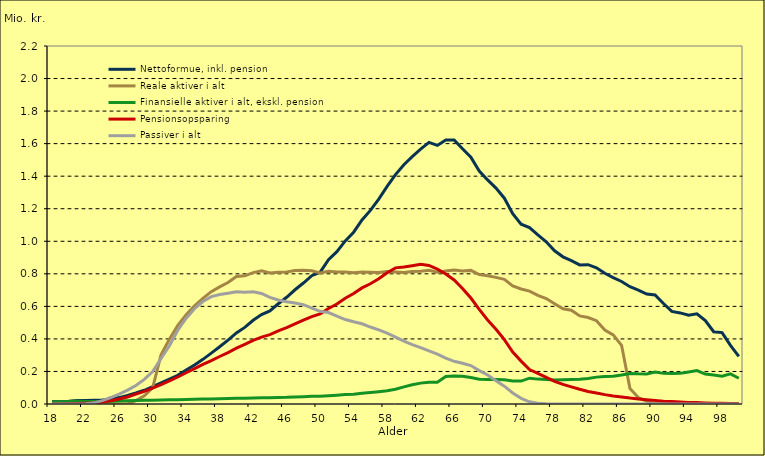
| Category | Nettoformue, inkl. pension | Reale aktiver i alt | Finansielle aktiver i alt, ekskl. pension | Pensionsopsparing | Passiver i alt |
|---|---|---|---|---|---|
| 18.0 | 0.015 | 0 | 0.014 | 0 | 0 |
| 19.0 | 0.015 | 0 | 0.014 | 0 | 0 |
| 20.0 | 0.017 | 0 | 0.015 | 0.001 | 0 |
| 21.0 | 0.022 | 0 | 0.018 | 0.002 | 0 |
| 22.0 | 0.021 | 0 | 0.015 | 0.005 | 0.001 |
| 23.0 | 0.023 | 0 | 0.015 | 0.008 | 0.007 |
| 24.0 | 0.025 | 0 | 0.015 | 0.013 | 0.021 |
| 25.0 | 0.03 | 0 | 0.016 | 0.019 | 0.04 |
| 26.0 | 0.039 | 0 | 0.018 | 0.03 | 0.061 |
| 27.0 | 0.053 | 0 | 0.019 | 0.043 | 0.085 |
| 28.0 | 0.068 | 0.021 | 0.021 | 0.06 | 0.114 |
| 29.0 | 0.084 | 0.05 | 0.022 | 0.078 | 0.152 |
| 30.0 | 0.106 | 0.1 | 0.024 | 0.098 | 0.2 |
| 31.0 | 0.129 | 0.302 | 0.025 | 0.119 | 0.28 |
| 32.0 | 0.153 | 0.399 | 0.026 | 0.142 | 0.358 |
| 33.0 | 0.176 | 0.483 | 0.027 | 0.166 | 0.453 |
| 34.0 | 0.209 | 0.548 | 0.028 | 0.192 | 0.527 |
| 35.0 | 0.24 | 0.603 | 0.029 | 0.218 | 0.586 |
| 36.0 | 0.274 | 0.649 | 0.03 | 0.243 | 0.629 |
| 37.0 | 0.313 | 0.69 | 0.031 | 0.266 | 0.66 |
| 38.0 | 0.352 | 0.72 | 0.033 | 0.292 | 0.673 |
| 39.0 | 0.392 | 0.747 | 0.034 | 0.316 | 0.681 |
| 40.0 | 0.437 | 0.783 | 0.035 | 0.343 | 0.689 |
| 41.0 | 0.471 | 0.788 | 0.036 | 0.366 | 0.687 |
| 42.0 | 0.515 | 0.808 | 0.037 | 0.391 | 0.689 |
| 43.0 | 0.549 | 0.818 | 0.039 | 0.411 | 0.68 |
| 44.0 | 0.572 | 0.805 | 0.038 | 0.427 | 0.655 |
| 45.0 | 0.616 | 0.809 | 0.04 | 0.449 | 0.639 |
| 46.0 | 0.656 | 0.812 | 0.041 | 0.469 | 0.629 |
| 47.0 | 0.702 | 0.82 | 0.043 | 0.493 | 0.621 |
| 48.0 | 0.743 | 0.822 | 0.045 | 0.515 | 0.61 |
| 49.0 | 0.788 | 0.819 | 0.048 | 0.537 | 0.59 |
| 50.0 | 0.81 | 0.805 | 0.047 | 0.554 | 0.569 |
| 51.0 | 0.887 | 0.815 | 0.051 | 0.587 | 0.562 |
| 52.0 | 0.936 | 0.811 | 0.054 | 0.614 | 0.54 |
| 53.0 | 1.002 | 0.81 | 0.058 | 0.65 | 0.519 |
| 54.0 | 1.056 | 0.807 | 0.06 | 0.679 | 0.505 |
| 55.0 | 1.131 | 0.811 | 0.065 | 0.713 | 0.493 |
| 56.0 | 1.19 | 0.809 | 0.07 | 0.739 | 0.473 |
| 57.0 | 1.259 | 0.808 | 0.076 | 0.77 | 0.456 |
| 58.0 | 1.337 | 0.815 | 0.081 | 0.807 | 0.435 |
| 59.0 | 1.41 | 0.812 | 0.09 | 0.837 | 0.412 |
| 60.0 | 1.471 | 0.809 | 0.105 | 0.842 | 0.386 |
| 61.0 | 1.521 | 0.815 | 0.118 | 0.85 | 0.365 |
| 62.0 | 1.566 | 0.815 | 0.128 | 0.858 | 0.346 |
| 63.0 | 1.608 | 0.821 | 0.134 | 0.851 | 0.326 |
| 64.0 | 1.589 | 0.809 | 0.134 | 0.828 | 0.306 |
| 65.0 | 1.623 | 0.817 | 0.169 | 0.799 | 0.282 |
| 66.0 | 1.623 | 0.823 | 0.172 | 0.762 | 0.262 |
| 67.0 | 1.569 | 0.818 | 0.17 | 0.71 | 0.25 |
| 68.0 | 1.517 | 0.821 | 0.163 | 0.651 | 0.236 |
| 69.0 | 1.432 | 0.795 | 0.153 | 0.582 | 0.205 |
| 70.0 | 1.377 | 0.788 | 0.15 | 0.516 | 0.179 |
| 71.0 | 1.327 | 0.778 | 0.151 | 0.46 | 0.144 |
| 72.0 | 1.265 | 0.766 | 0.149 | 0.395 | 0.11 |
| 73.0 | 1.17 | 0.726 | 0.142 | 0.32 | 0.068 |
| 74.0 | 1.105 | 0.707 | 0.141 | 0.264 | 0.035 |
| 75.0 | 1.085 | 0.693 | 0.159 | 0.212 | 0.014 |
| 76.0 | 1.039 | 0.667 | 0.153 | 0.188 | 0.004 |
| 77.0 | 0.997 | 0.648 | 0.15 | 0.163 | 0.001 |
| 78.0 | 0.941 | 0.617 | 0.147 | 0.138 | 0 |
| 79.0 | 0.904 | 0.586 | 0.15 | 0.121 | 0 |
| 80.0 | 0.881 | 0.577 | 0.151 | 0.105 | 0 |
| 81.0 | 0.855 | 0.541 | 0.152 | 0.09 | 0 |
| 82.0 | 0.856 | 0.531 | 0.157 | 0.077 | 0 |
| 83.0 | 0.837 | 0.512 | 0.165 | 0.067 | 0 |
| 84.0 | 0.803 | 0.455 | 0.169 | 0.058 | 0 |
| 85.0 | 0.777 | 0.424 | 0.17 | 0.05 | 0 |
| 86.0 | 0.753 | 0.361 | 0.178 | 0.043 | 0 |
| 87.0 | 0.721 | 0.095 | 0.187 | 0.036 | 0 |
| 88.0 | 0.7 | 0.039 | 0.185 | 0.031 | 0 |
| 89.0 | 0.676 | 0.017 | 0.185 | 0.026 | 0 |
| 90.0 | 0.671 | 0.01 | 0.196 | 0.022 | 0 |
| 91.0 | 0.617 | 0 | 0.188 | 0.017 | 0 |
| 92.0 | 0.569 | 0 | 0.187 | 0.015 | 0 |
| 93.0 | 0.56 | 0 | 0.188 | 0.012 | 0 |
| 94.0 | 0.545 | 0 | 0.197 | 0.01 | 0 |
| 95.0 | 0.554 | 0 | 0.205 | 0.009 | 0 |
| 96.0 | 0.512 | 0 | 0.184 | 0.007 | 0 |
| 97.0 | 0.444 | 0 | 0.178 | 0.005 | 0 |
| 98.0 | 0.439 | 0 | 0.17 | 0.004 | 0 |
| 99.0 | 0.36 | 0 | 0.185 | 0.003 | 0 |
| 100.0 | 0.293 | 0 | 0.158 | 0.003 | 0 |